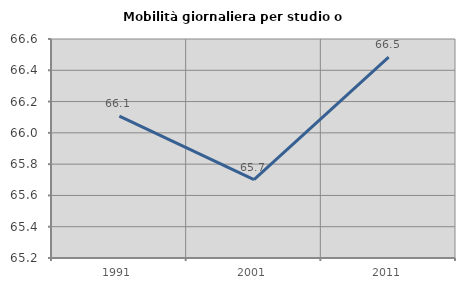
| Category | Mobilità giornaliera per studio o lavoro |
|---|---|
| 1991.0 | 66.106 |
| 2001.0 | 65.701 |
| 2011.0 | 66.484 |